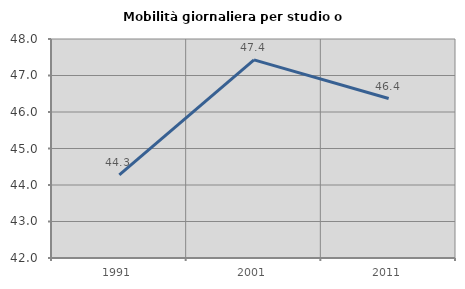
| Category | Mobilità giornaliera per studio o lavoro |
|---|---|
| 1991.0 | 44.276 |
| 2001.0 | 47.427 |
| 2011.0 | 46.369 |